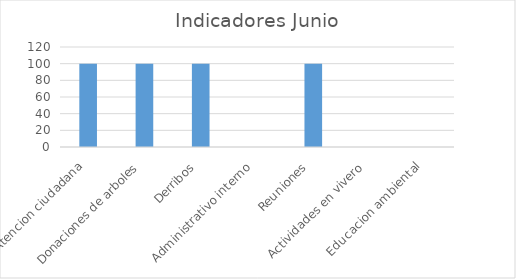
| Category | Series 0 |
|---|---|
| Atencion ciudadana  | 100 |
| Donaciones de arboles  | 100 |
| Derribos  | 100 |
| Administrativo interno  | 0 |
| Reuniones  | 100 |
| Actividades en vivero  | 0 |
| Educacion ambiental  | 0 |